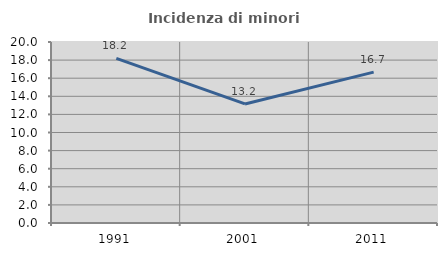
| Category | Incidenza di minori stranieri |
|---|---|
| 1991.0 | 18.182 |
| 2001.0 | 13.158 |
| 2011.0 | 16.667 |